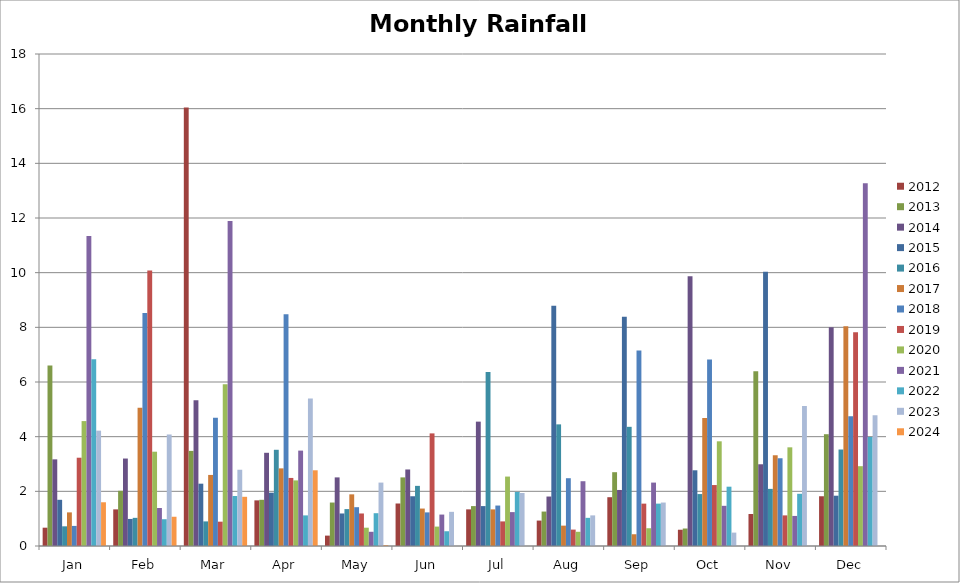
| Category | 2012 | 2013 | 2014 | 2015 | 2016 | 2017 | 2018 | 2019 | 2020 | 2021 | 2022 | 2023 | 2024 |
|---|---|---|---|---|---|---|---|---|---|---|---|---|---|
| Jan | 0.67 | 6.6 | 3.17 | 1.69 | 0.72 | 1.23 | 0.735 | 3.23 | 4.57 | 11.34 | 6.83 | 4.22 | 1.6 |
| Feb | 1.34 | 2.02 | 3.2 | 0.99 | 1.03 | 5.06 | 8.525 | 10.08 | 3.45 | 1.39 | 0.98 | 4.08 | 1.07 |
| Mar | 16.04 | 3.48 | 5.33 | 2.28 | 0.9 | 2.6 | 4.69 | 0.89 | 5.92 | 11.89 | 1.83 | 2.79 | 1.8 |
| Apr | 1.67 | 1.69 | 3.41 | 1.95 | 3.52 | 2.84 | 8.48 | 2.49 | 2.4 | 3.49 | 1.12 | 5.4 | 2.77 |
| May | 0.38 | 1.59 | 2.51 | 1.19 | 1.35 | 1.89 | 1.42 | 1.19 | 0.67 | 0.52 | 1.2 | 2.32 | 0.03 |
| Jun | 1.555 | 2.51 | 2.8 | 1.82 | 2.2 | 1.37 | 1.23 | 4.12 | 0.71 | 1.15 | 0.54 | 1.25 | 0 |
| Jul | 1.34 | 1.46 | 4.55 | 1.46 | 6.37 | 1.34 | 1.48 | 0.9 | 2.54 | 1.24 | 1.98 | 1.94 | 0 |
| Aug | 0.93 | 1.26 | 1.81 | 8.79 | 4.45 | 0.745 | 2.48 | 0.6 | 0.52 | 2.37 | 1.03 | 1.12 | 0 |
| Sep | 1.785 | 2.7 | 2.05 | 8.39 | 4.36 | 0.43 | 7.15 | 1.55 | 0.65 | 2.32 | 1.55 | 1.59 | 0 |
| Oct | 0.595 | 0.64 | 9.87 | 2.77 | 1.9 | 4.685 | 6.82 | 2.23 | 3.83 | 1.47 | 2.17 | 0.49 | 0 |
| Nov | 1.17 | 6.39 | 2.99 | 10.03 | 2.09 | 3.32 | 3.21 | 1.12 | 3.61 | 1.1 | 1.91 | 5.12 | 0 |
| Dec | 1.82 | 4.09 | 8 | 1.84 | 3.53 | 8.04 | 4.75 | 7.82 | 2.92 | 13.27 | 3.99 | 4.78 | 0 |